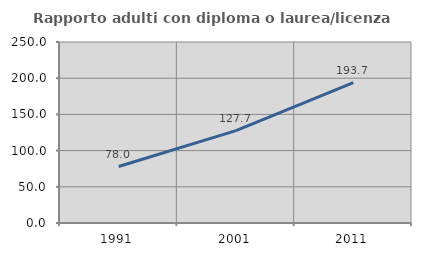
| Category | Rapporto adulti con diploma o laurea/licenza media  |
|---|---|
| 1991.0 | 77.984 |
| 2001.0 | 127.655 |
| 2011.0 | 193.737 |